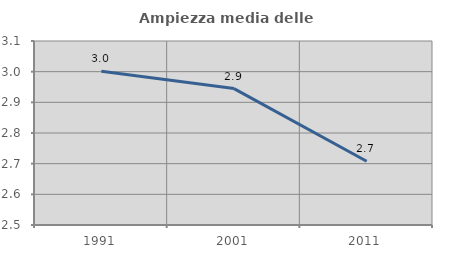
| Category | Ampiezza media delle famiglie |
|---|---|
| 1991.0 | 3.001 |
| 2001.0 | 2.945 |
| 2011.0 | 2.708 |